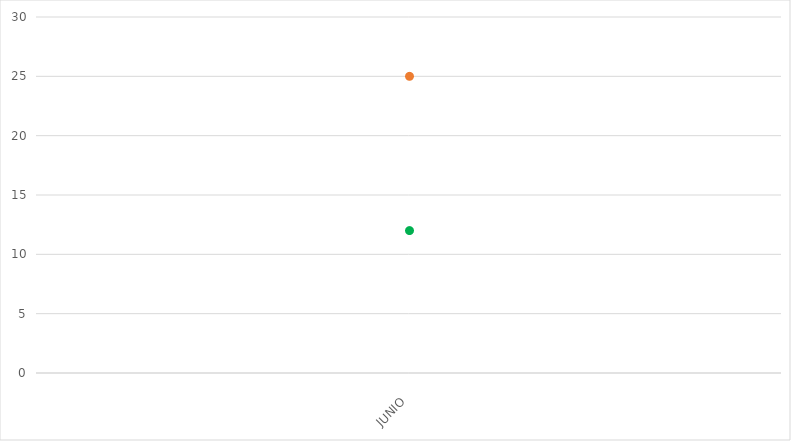
| Category | VALOR  | META PONDERADA |
|---|---|---|
| JUNIO | 25 | 12 |